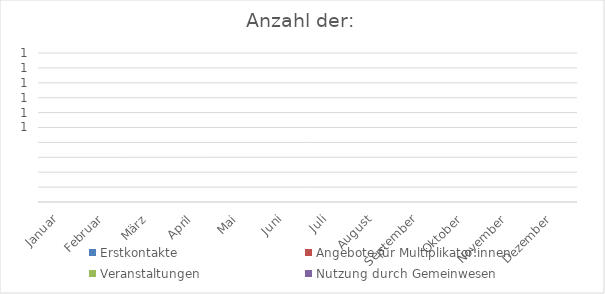
| Category | Erstkontakte | Angebote für Multiplikator:innen | Veranstaltungen | Nutzung durch Gemeinwesen |
|---|---|---|---|---|
| Januar | 0 | 0 | 0 | 0 |
| Februar | 0 | 0 | 0 | 0 |
| März | 0 | 0 | 0 | 0 |
| April | 0 | 0 | 0 | 0 |
| Mai | 0 | 0 | 0 | 0 |
| Juni | 0 | 0 | 0 | 0 |
| Juli | 0 | 0 | 0 | 0 |
| August | 0 | 0 | 0 | 0 |
| September | 0 | 0 | 0 | 0 |
| Oktober | 0 | 0 | 0 | 0 |
| November | 0 | 0 | 0 | 0 |
| Dezember | 0 | 0 | 0 | 0 |